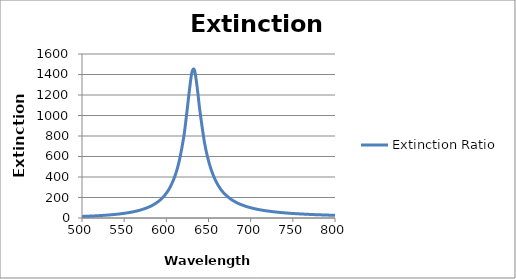
| Category | Extinction Ratio |
|---|---|
| 500.0 | 15.408 |
| 503.03 | 16.336 |
| 506.06 | 17.299 |
| 509.09 | 18.397 |
| 512.12 | 19.545 |
| 515.15 | 20.734 |
| 518.18 | 22.101 |
| 521.21 | 23.528 |
| 524.24 | 25.093 |
| 527.27 | 26.815 |
| 530.3 | 28.616 |
| 533.33 | 30.6 |
| 536.36 | 32.792 |
| 539.39 | 35.224 |
| 542.42 | 37.779 |
| 545.45 | 40.785 |
| 548.48 | 43.969 |
| 551.52 | 47.325 |
| 554.55 | 51.307 |
| 557.58 | 55.54 |
| 560.61 | 60.31 |
| 563.64 | 65.716 |
| 566.67 | 71.866 |
| 569.7 | 78.474 |
| 572.73 | 86.524 |
| 575.76 | 95.273 |
| 578.79 | 105.403 |
| 581.82 | 116.424 |
| 584.85 | 130.17 |
| 587.88 | 145.363 |
| 590.91 | 163.339 |
| 593.94 | 184.817 |
| 596.97 | 210.737 |
| 600.0 | 242.402 |
| 603.03 | 278.71 |
| 606.06 | 327.167 |
| 609.09 | 384.316 |
| 612.12 | 457.034 |
| 615.15 | 550.935 |
| 618.18 | 673.651 |
| 621.21 | 821.507 |
| 624.24 | 1023.604 |
| 627.27 | 1239.791 |
| 630.3 | 1419.624 |
| 633.33 | 1442.853 |
| 636.36 | 1288.455 |
| 639.39 | 1072.226 |
| 642.42 | 888.541 |
| 645.45 | 726.22 |
| 648.48 | 608.131 |
| 651.52 | 514.539 |
| 654.55 | 439.886 |
| 657.58 | 379.771 |
| 660.61 | 330.825 |
| 663.64 | 290.546 |
| 666.67 | 257.056 |
| 669.7 | 231.113 |
| 672.73 | 208.844 |
| 675.76 | 187.985 |
| 678.79 | 171.461 |
| 681.82 | 156.998 |
| 684.85 | 144.271 |
| 687.88 | 133.014 |
| 690.91 | 123.874 |
| 693.94 | 114.857 |
| 696.97 | 106.782 |
| 700.0 | 100.152 |
| 703.03 | 94.109 |
| 706.06 | 88.071 |
| 709.09 | 83.064 |
| 712.12 | 78.471 |
| 715.15 | 74.242 |
| 718.18 | 70.345 |
| 721.21 | 67.089 |
| 724.24 | 63.728 |
| 727.27 | 60.61 |
| 730.3 | 57.993 |
| 733.33 | 55.276 |
| 736.36 | 52.99 |
| 739.39 | 50.841 |
| 742.42 | 48.599 |
| 745.45 | 46.705 |
| 748.48 | 44.919 |
| 751.52 | 43.231 |
| 754.55 | 41.634 |
| 757.58 | 40.287 |
| 760.61 | 38.847 |
| 763.64 | 37.482 |
| 766.67 | 36.328 |
| 769.7 | 35.09 |
| 772.73 | 34.04 |
| 775.76 | 32.914 |
| 778.79 | 31.958 |
| 781.82 | 31.043 |
| 784.85 | 30.166 |
| 787.88 | 29.222 |
| 790.91 | 28.418 |
| 793.94 | 27.647 |
| 796.97 | 26.996 |
| 800.0 | 26.28 |